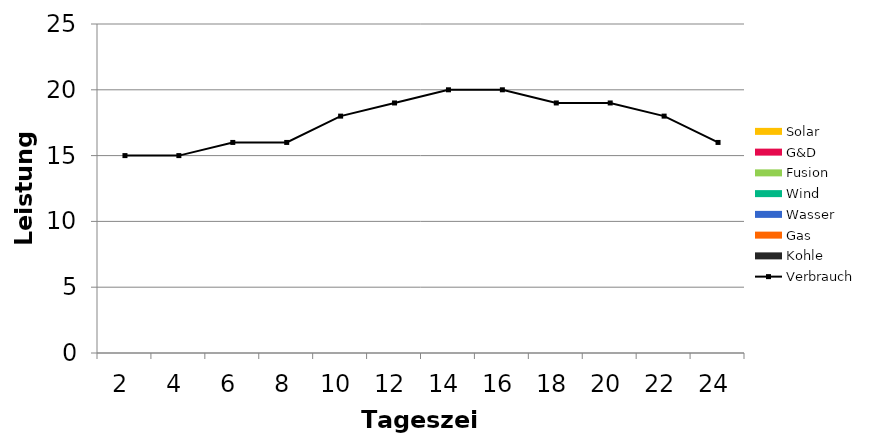
| Category | Kohle | Gas | Wasser | Wind | Fusion | G&D | Solar |
|---|---|---|---|---|---|---|---|
| 2.0 | 0 | 0 | 0 | 0 | 0 | 0 | 0 |
| 4.0 | 0 | 0 | 0 | 0 | 0 | 0 | 0 |
| 6.0 | 0 | 0 | 0 | 0 | 0 | 0 | 0 |
| 8.0 | 0 | 0 | 0 | 0 | 0 | 0 | 0 |
| 10.0 | 0 | 0 | 0 | 0 | 0 | 0 | 0 |
| 12.0 | 0 | 0 | 0 | 0 | 0 | 0 | 0 |
| 14.0 | 0 | 0 | 0 | 0 | 0 | 0 | 0 |
| 16.0 | 0 | 0 | 0 | 0 | 0 | 0 | 0 |
| 18.0 | 0 | 0 | 0 | 0 | 0 | 0 | 0 |
| 20.0 | 0 | 0 | 0 | 0 | 0 | 0 | 0 |
| 22.0 | 0 | 0 | 0 | 0 | 0 | 0 | 0 |
| 24.0 | 0 | 0 | 0 | 0 | 0 | 0 | 0 |